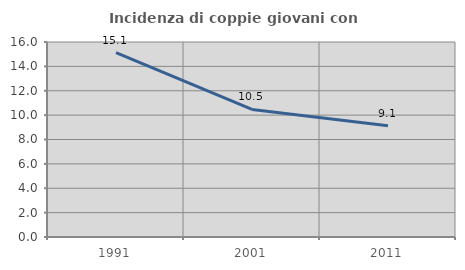
| Category | Incidenza di coppie giovani con figli |
|---|---|
| 1991.0 | 15.138 |
| 2001.0 | 10.463 |
| 2011.0 | 9.128 |